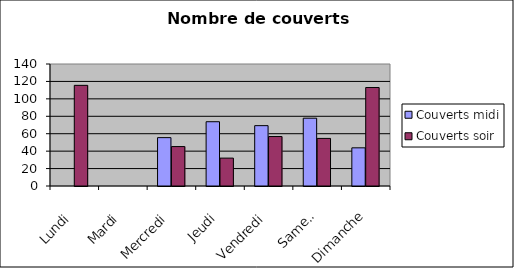
| Category | Couverts |
|---|---|
| Lundi | 115.5 |
| Mardi | 0 |
| Mercredi | 45.25 |
| Jeudi | 32 |
| Vendredi | 56.75 |
| Samedi | 54.6 |
| Dimanche | 113 |